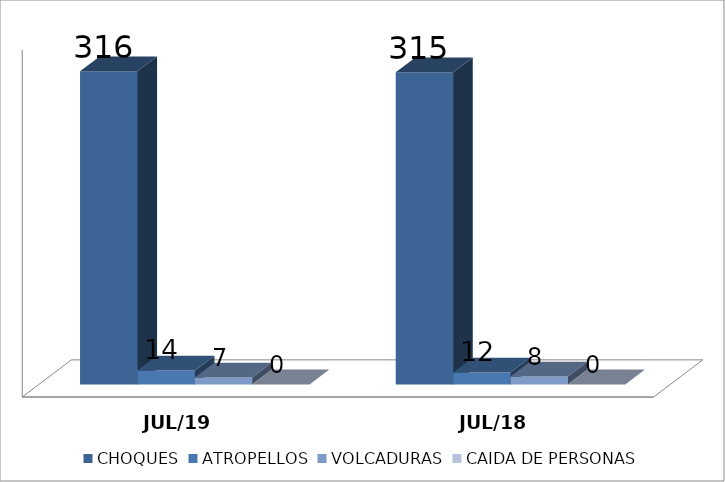
| Category | CHOQUES | ATROPELLOS | VOLCADURAS | CAIDA DE PERSONAS |
|---|---|---|---|---|
| JUL/19 | 316 | 14 | 7 | 0 |
| JUL/18 | 315 | 12 | 8 | 0 |